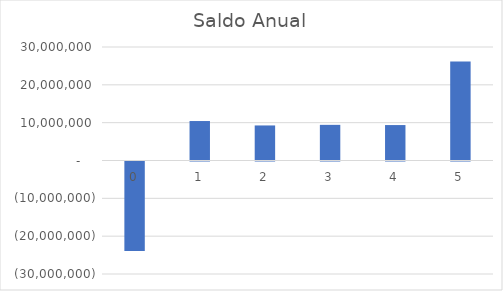
| Category | Saldo Anual |
|---|---|
| 0.0 | -23665894.255 |
| 1.0 | 10432808.937 |
| 2.0 | 9264303.171 |
| 3.0 | 9424488.725 |
| 4.0 | 9366875.645 |
| 5.0 | 26175820.777 |